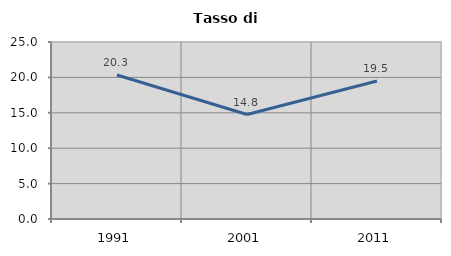
| Category | Tasso di disoccupazione   |
|---|---|
| 1991.0 | 20.341 |
| 2001.0 | 14.759 |
| 2011.0 | 19.493 |